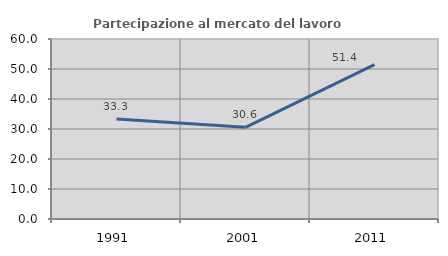
| Category | Partecipazione al mercato del lavoro  femminile |
|---|---|
| 1991.0 | 33.333 |
| 2001.0 | 30.556 |
| 2011.0 | 51.429 |